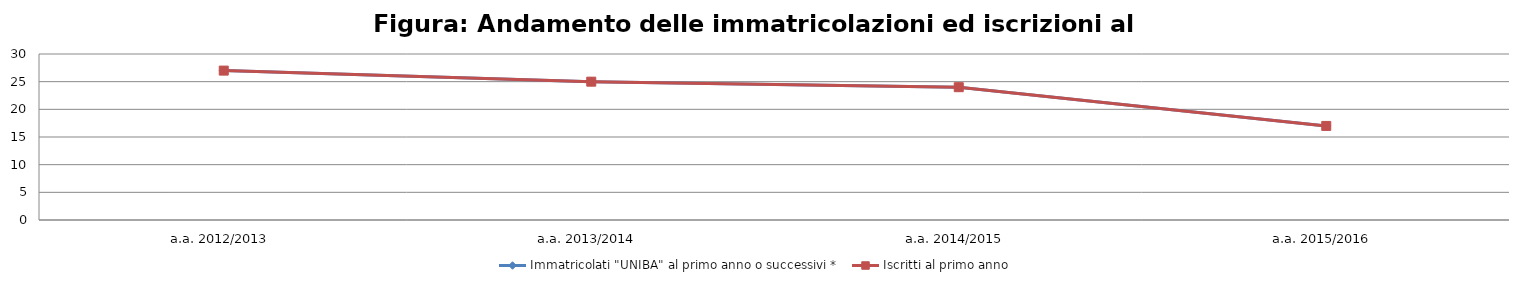
| Category | Immatricolati "UNIBA" al primo anno o successivi * | Iscritti al primo anno  |
|---|---|---|
| a.a. 2012/2013 | 27 | 27 |
| a.a. 2013/2014 | 25 | 25 |
| a.a. 2014/2015 | 24 | 24 |
| a.a. 2015/2016 | 17 | 17 |